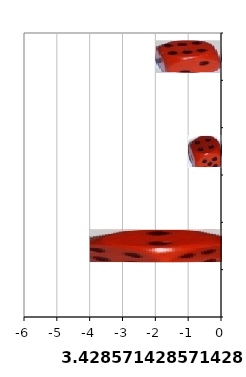
| Category | Series 1 |
|---|---|
| 1.0 | 0 |
| 2.0 | -4 |
| 3.0 | 0 |
| 4.0 | -1 |
| 5.0 | 0 |
| 6.0 | -2 |